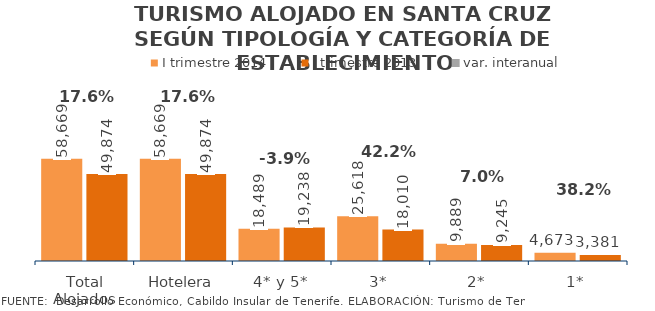
| Category | I trimestre 2014 | I trimestre 2013 |
|---|---|---|
| Total Alojados | 58669 | 49874 |
| Hotelera | 58669 | 49874 |
| 4* y 5* | 18489 | 19238 |
| 3* | 25618 | 18010 |
| 2* | 9889 | 9245 |
| 1* | 4673 | 3381 |